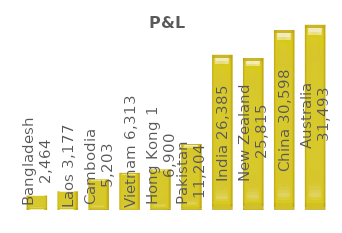
| Category |  Australia  |  China  |  New Zealand  |  India  |  Pakistan  |  Hong Kong  |  Vietnam  |  Cambodia  |  Laos  |  Bangladesh  |
|---|---|---|---|---|---|---|---|---|---|---|
| 0 | 31492.526 | 30597.703 | 25814.654 | 26385.448 | 11203.629 | 6899.582 | 6312.67 | 5203.23 | 3177.465 | 2463.88 |